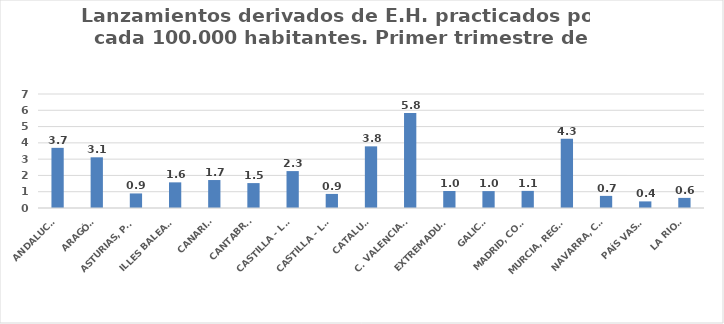
| Category | Series 0 |
|---|---|
| ANDALUCÍA | 3.693 |
| ARAGÓN | 3.113 |
| ASTURIAS, PRINCIPADO | 0.894 |
| ILLES BALEARS | 1.575 |
| CANARIAS | 1.717 |
| CANTABRIA | 1.529 |
| CASTILLA - LEÓN | 2.266 |
| CASTILLA - LA MANCHA | 0.865 |
| CATALUÑA | 3.785 |
| C. VALENCIANA | 5.826 |
| EXTREMADURA | 1.043 |
| GALICIA | 1.037 |
| MADRID, COMUNIDAD | 1.051 |
| MURCIA, REGIÓN | 4.251 |
| NAVARRA, COM. FORAL | 0.744 |
| PAÍS VASCO | 0.405 |
| LA RIOJA | 0.621 |